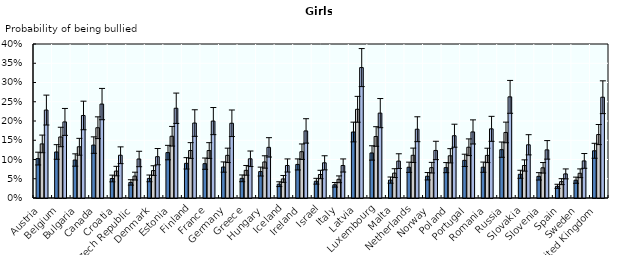
| Category | Healthy weight | Pre-obese | Obese |
|---|---|---|---|
| Austria | 0.102 | 0.141 | 0.228 |
| Belgium | 0.12 | 0.158 | 0.198 |
| Bulgaria | 0.099 | 0.133 | 0.214 |
| Canada | 0.137 | 0.183 | 0.244 |
| Croatia | 0.051 | 0.07 | 0.111 |
| Czech Republic | 0.04 | 0.057 | 0.101 |
| Denmark | 0.051 | 0.071 | 0.107 |
| Estonia | 0.118 | 0.16 | 0.233 |
| Finland | 0.09 | 0.123 | 0.195 |
| France | 0.089 | 0.123 | 0.2 |
| Germany | 0.08 | 0.111 | 0.194 |
| Greece | 0.051 | 0.072 | 0.102 |
| Hungary | 0.069 | 0.094 | 0.132 |
| Iceland | 0.036 | 0.05 | 0.084 |
| Ireland | 0.087 | 0.12 | 0.174 |
| Israel | 0.044 | 0.061 | 0.091 |
| Italy | 0.034 | 0.049 | 0.084 |
| Latvia | 0.171 | 0.23 | 0.339 |
| Luxembourg | 0.117 | 0.16 | 0.22 |
| Malta | 0.047 | 0.065 | 0.096 |
| Netherlands | 0.08 | 0.111 | 0.179 |
| Norway | 0.057 | 0.079 | 0.123 |
| Poland | 0.079 | 0.11 | 0.162 |
| Portugal | 0.098 | 0.132 | 0.172 |
| Romania | 0.08 | 0.111 | 0.18 |
| Russia | 0.126 | 0.17 | 0.263 |
| Slovakia | 0.062 | 0.084 | 0.138 |
| Slovenia | 0.056 | 0.078 | 0.125 |
| Spain | 0.03 | 0.042 | 0.063 |
| Sweden | 0.046 | 0.064 | 0.096 |
| United Kingdom | 0.123 | 0.165 | 0.262 |